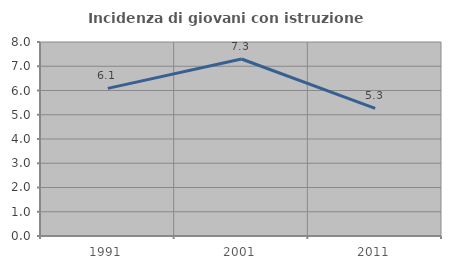
| Category | Incidenza di giovani con istruzione universitaria |
|---|---|
| 1991.0 | 6.087 |
| 2001.0 | 7.299 |
| 2011.0 | 5.263 |